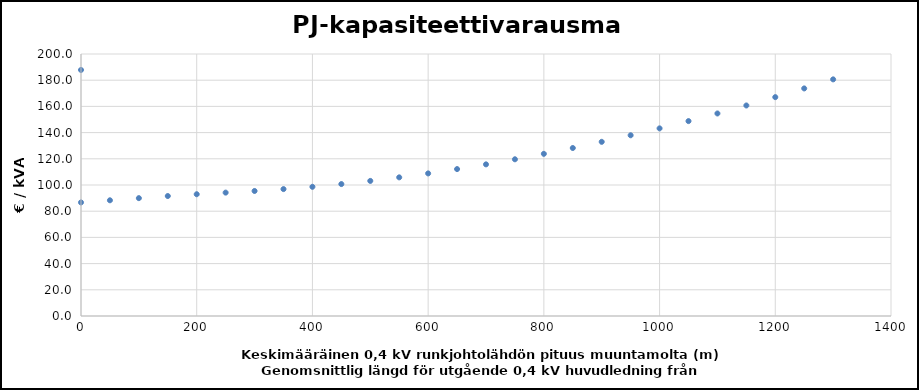
| Category | PJ kapasiteettivarausmaksu |
|---|---|
| 0.0 | 86.693 |
| 50.0 | 88.329 |
| 100.0 | 89.966 |
| 150.0 | 91.582 |
| 200.0 | 92.961 |
| 250.0 | 94.19 |
| 300.0 | 95.44 |
| 350.0 | 96.876 |
| 400.0 | 98.625 |
| 450.0 | 100.713 |
| 500.0 | 103.121 |
| 550.0 | 105.836 |
| 600.0 | 108.85 |
| 650.0 | 112.157 |
| 700.0 | 115.752 |
| 750.0 | 119.632 |
| 800.0 | 123.794 |
| 850.0 | 128.236 |
| 900.0 | 132.957 |
| 950.0 | 137.955 |
| 1000.0 | 143.229 |
| 1050.0 | 148.779 |
| 1100.0 | 154.603 |
| 1150.0 | 160.702 |
| 1200.0 | 167.074 |
| 1250.0 | 173.719 |
| 1300.0 | 180.637 |